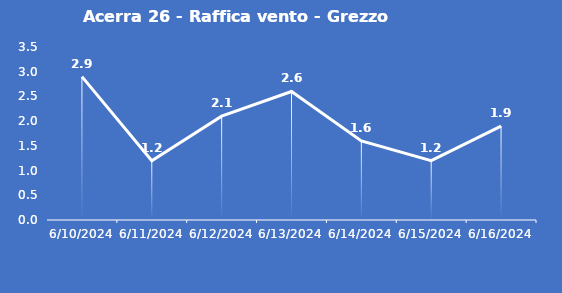
| Category | Acerra 26 - Raffica vento - Grezzo (m/s) |
|---|---|
| 6/10/24 | 2.9 |
| 6/11/24 | 1.2 |
| 6/12/24 | 2.1 |
| 6/13/24 | 2.6 |
| 6/14/24 | 1.6 |
| 6/15/24 | 1.2 |
| 6/16/24 | 1.9 |